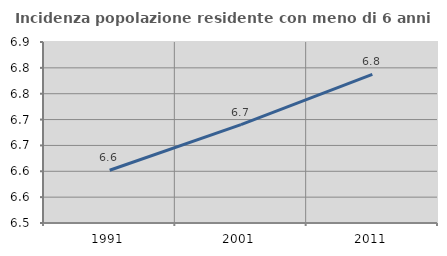
| Category | Incidenza popolazione residente con meno di 6 anni |
|---|---|
| 1991.0 | 6.602 |
| 2001.0 | 6.69 |
| 2011.0 | 6.787 |